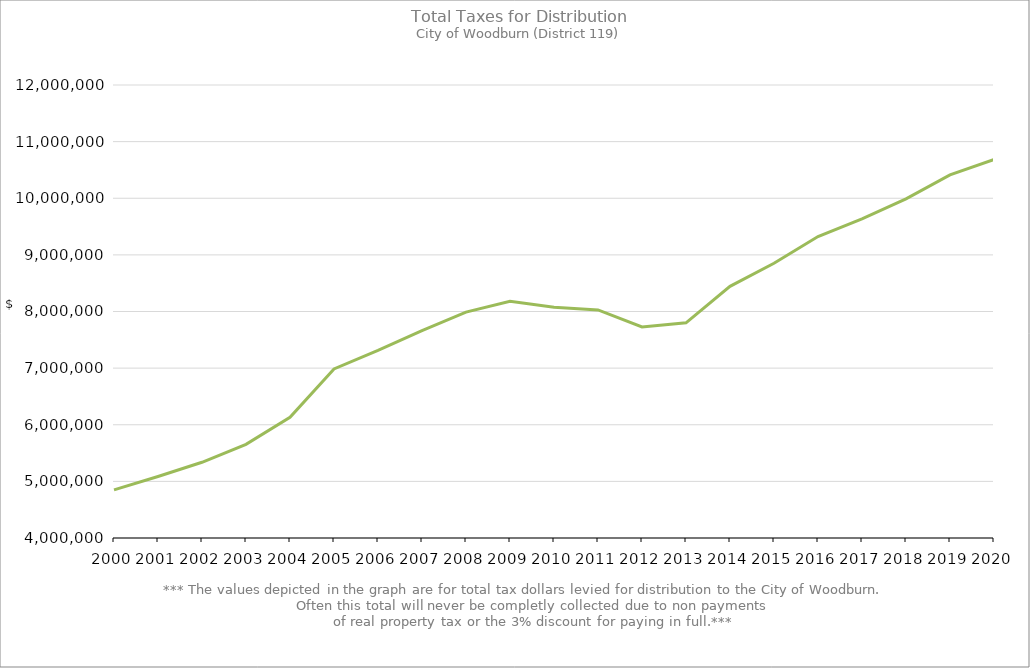
| Category | Series 0 |
|---|---|
| 2000.0 | 4851012.39 |
| 2001.0 | 5085066.91 |
| 2002.0 | 5336839.51 |
| 2003.0 | 5654405.23 |
| 2004.0 | 6132263.43 |
| 2005.0 | 6985427.87 |
| 2006.0 | 7312160.84 |
| 2007.0 | 7664151.35 |
| 2008.0 | 7988417.77 |
| 2009.0 | 8181947.14 |
| 2010.0 | 8074513.93 |
| 2011.0 | 8028046.56 |
| 2012.0 | 7727344.66 |
| 2013.0 | 7799444.02 |
| 2014.0 | 8443768.93 |
| 2015.0 | 8851371.26 |
| 2016.0 | 9323403.22 |
| 2017.0 | 9635529.9 |
| 2018.0 | 9989150.69 |
| 2019.0 | 10411789.18 |
| 2020.0 | 10684429.08 |